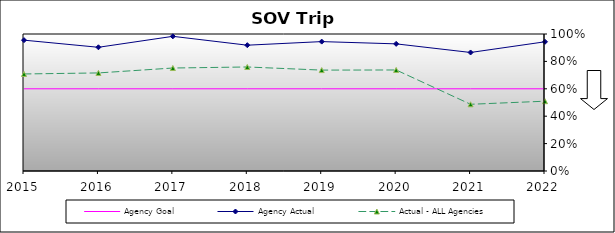
| Category | Agency Goal | Agency Actual | Actual - ALL Agencies |
|---|---|---|---|
| 2015.0 | 0.6 | 0.955 | 0.708 |
| 2016.0 | 0.6 | 0.903 | 0.716 |
| 2017.0 | 0.6 | 0.983 | 0.752 |
| 2018.0 | 0.6 | 0.918 | 0.759 |
| 2019.0 | 0.6 | 0.944 | 0.736 |
| 2020.0 | 0.6 | 0.928 | 0.737 |
| 2021.0 | 0.6 | 0.865 | 0.487 |
| 2022.0 | 0.6 | 0.943 | 0.509 |